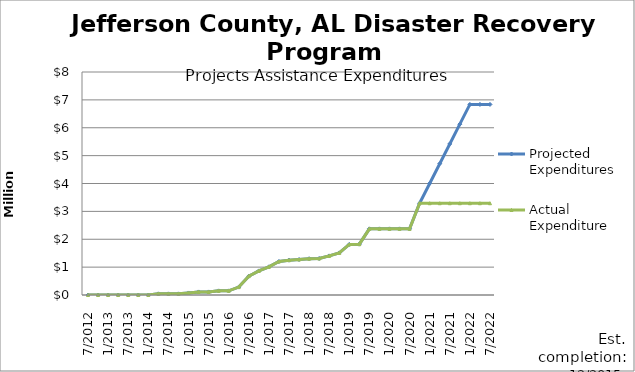
| Category | Projected Expenditures | Actual Expenditure |
|---|---|---|
| 7/2012 | 0 | 0 |
| 10/2012 | 0 | 0 |
| 1/2013 | 0 | 0 |
| 4/2013 | 0 | 0 |
| 7/2013 | 0 | 0 |
| 10/2013 | 0 | 0 |
| 1/2014 | 0 | 0 |
| 4/2014 | 41318 | 41317.67 |
| 7/2014 | 41318 | 41317.67 |
| 10/2014 | 41318 | 41317.67 |
| 1/2015 | 73002 | 73002.02 |
| 4/2015 | 110174 | 110173.94 |
| 7/2015 | 110174 | 110173.94 |
| 10/2015 | 148084 | 148083.71 |
| 1/2016 | 148084 | 148083.71 |
| 4/2016 | 284582 | 284581.89 |
| 7/2016 | 676889 | 676888.96 |
| 10/2016 | 864645 | 864644.95 |
| 1/2017 | 1010025 | 1010025.39 |
| 4/2017 | 1201254 | 1201253.93 |
| 7/2017 | 1249579 | 1249579.37 |
| 10/2017 | 1272809 | 1272809.51 |
| 1/2018 | 1302385 | 1302385.74 |
| 4/2018 | 1308333 | 1308333.98 |
| 7/2018 | 1402617 | 1402617.71 |
| 10/2018 | 1508673 | 1508673.58 |
| 1/2019 | 1815355 | 1815355.37 |
| 4/2019 | 1824184 | 1824184.28 |
| 7/2019 | 2373163 | 2373163.1 |
| 10/2019 | 2373163 | 2373163.1 |
| 1/2020 | 2373163 | 2373163.1 |
| 4/2020 | 2373163 | 2373163.1 |
| 7/2020 | 2373163 | 2373163.1 |
| 10/2020 | 3291990 | 3291989.96 |
| 1/2021 | 4000937.96 | 3291989.96 |
| 4/2021 | 4709885.92 | 3291989.96 |
| 7/2021 | 5418833.88 | 3291989.96 |
| 10/2021 | 6127781.84 | 3291989.96 |
| 1/2022 | 6836729.8 | 3291989.96 |
| 4/2022 | 6836729.8 | 3291989.96 |
| 7/2022 | 6836729.8 | 3291989.96 |